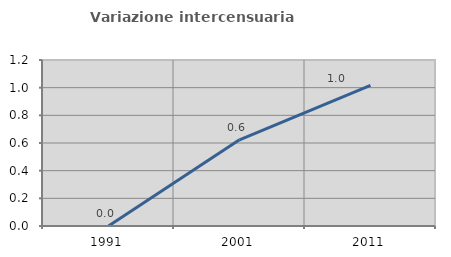
| Category | Variazione intercensuaria annua |
|---|---|
| 1991.0 | 0 |
| 2001.0 | 0.623 |
| 2011.0 | 1.017 |